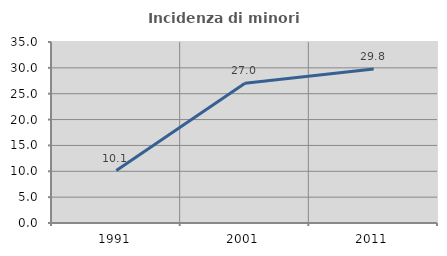
| Category | Incidenza di minori stranieri |
|---|---|
| 1991.0 | 10.145 |
| 2001.0 | 27.032 |
| 2011.0 | 29.801 |